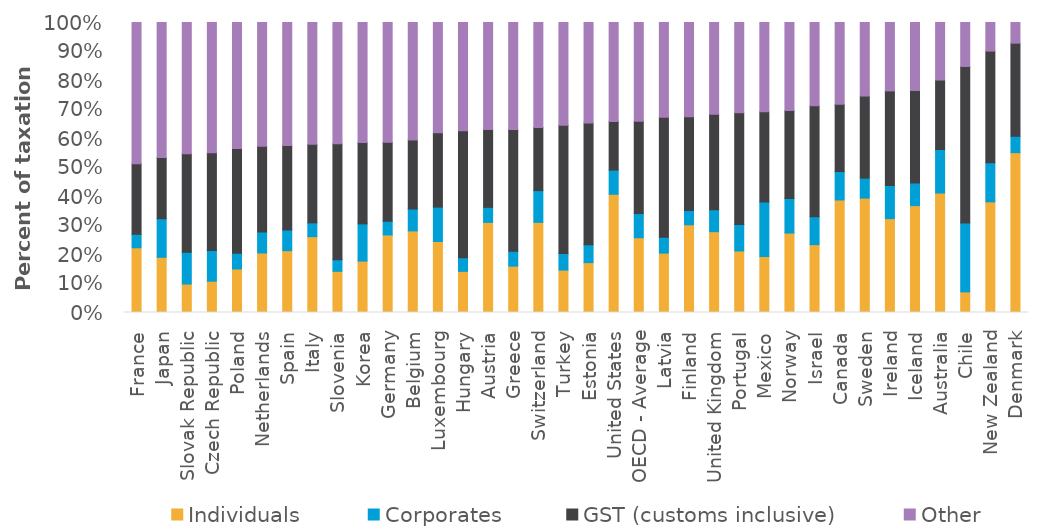
| Category | Individuals | Corporates | GST (customs inclusive) | Other |
|---|---|---|---|---|
| France | 0.223 | 0.046 | 0.244 | 0.487 |
| Japan | 0.19 | 0.133 | 0.211 | 0.466 |
| Slovak Republic | 0.098 | 0.11 | 0.34 | 0.452 |
| Czech Republic | 0.108 | 0.106 | 0.336 | 0.449 |
| Poland | 0.15 | 0.054 | 0.361 | 0.435 |
| Netherlands | 0.205 | 0.072 | 0.296 | 0.427 |
| Spain | 0.213 | 0.071 | 0.292 | 0.424 |
| Italy | 0.262 | 0.048 | 0.271 | 0.42 |
| Slovenia | 0.142 | 0.04 | 0.399 | 0.418 |
| Korea | 0.177 | 0.128 | 0.28 | 0.414 |
| Germany | 0.267 | 0.047 | 0.272 | 0.413 |
| Belgium | 0.281 | 0.076 | 0.238 | 0.405 |
| Luxembourg | 0.245 | 0.119 | 0.256 | 0.381 |
| Hungary | 0.142 | 0.047 | 0.437 | 0.374 |
| Austria | 0.311 | 0.052 | 0.269 | 0.369 |
| Greece | 0.16 | 0.051 | 0.42 | 0.369 |
| Switzerland | 0.311 | 0.109 | 0.218 | 0.362 |
| Turkey | 0.146 | 0.057 | 0.443 | 0.354 |
| Estonia | 0.172 | 0.062 | 0.42 | 0.347 |
| United States | 0.408 | 0.083 | 0.168 | 0.341 |
| OECD - Average | 0.258 | 0.083 | 0.319 | 0.34 |
| Latvia | 0.205 | 0.055 | 0.413 | 0.327 |
| Finland | 0.302 | 0.049 | 0.323 | 0.325 |
| United Kingdom | 0.279 | 0.075 | 0.329 | 0.316 |
| Portugal | 0.212 | 0.092 | 0.385 | 0.311 |
| Mexico | 0.193 | 0.188 | 0.311 | 0.308 |
| Norway | 0.274 | 0.119 | 0.304 | 0.303 |
| Israel | 0.234 | 0.096 | 0.383 | 0.287 |
| Canada | 0.388 | 0.098 | 0.232 | 0.282 |
| Sweden | 0.394 | 0.069 | 0.283 | 0.254 |
| Ireland | 0.324 | 0.114 | 0.327 | 0.236 |
| Iceland | 0.369 | 0.078 | 0.319 | 0.234 |
| Australia | 0.412 | 0.15 | 0.239 | 0.198 |
| Chile | 0.071 | 0.237 | 0.54 | 0.152 |
| New Zealand | 0.382 | 0.135 | 0.385 | 0.099 |
| Denmark | 0.551 | 0.057 | 0.321 | 0.071 |